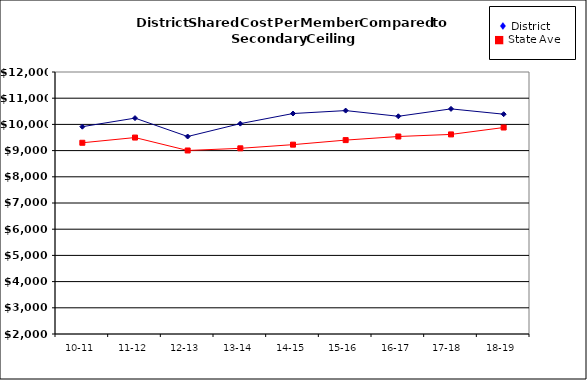
| Category | Series 0 | Series 1 |
|---|---|---|
| 10-11 | 9912.84 | 9299 |
| 11-12 | 10239.98 | 9498 |
| 12-13 | 9538.13 | 9005 |
| 13-14 | 10029.07 | 9087 |
| 14-15 | 10414.84 | 9227 |
| 15-16 | 10527.27 | 9401 |
| 16-17 | 10309.61 | 9538 |
| 17-18  | 10592.28 | 9618 |
| 18-19 | 10389.31 | 9881 |